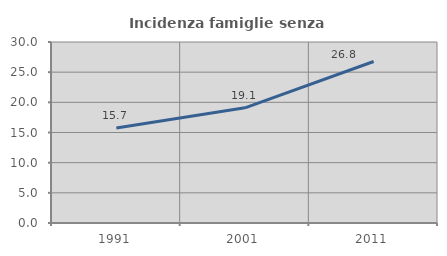
| Category | Incidenza famiglie senza nuclei |
|---|---|
| 1991.0 | 15.749 |
| 2001.0 | 19.085 |
| 2011.0 | 26.769 |